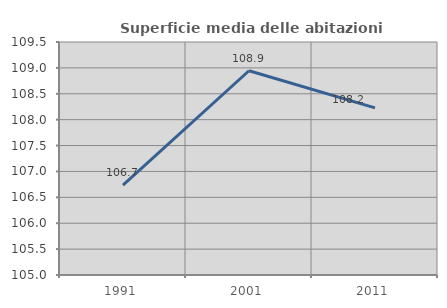
| Category | Superficie media delle abitazioni occupate |
|---|---|
| 1991.0 | 106.736 |
| 2001.0 | 108.944 |
| 2011.0 | 108.227 |